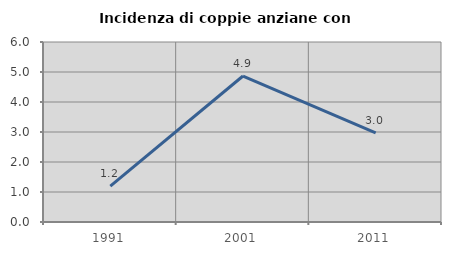
| Category | Incidenza di coppie anziane con figli |
|---|---|
| 1991.0 | 1.193 |
| 2001.0 | 4.866 |
| 2011.0 | 2.97 |